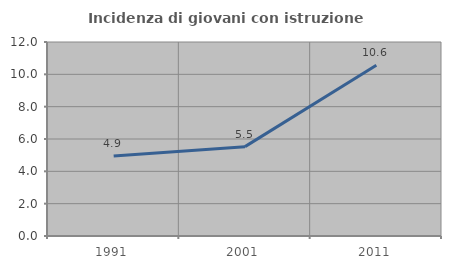
| Category | Incidenza di giovani con istruzione universitaria |
|---|---|
| 1991.0 | 4.945 |
| 2001.0 | 5.528 |
| 2011.0 | 10.559 |